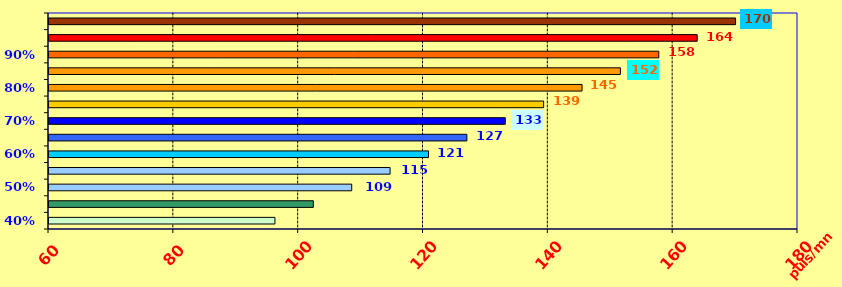
| Category | fréquences cardiaques |
|---|---|
| 40.0 | 96.2 |
| 45.0 | 102.35 |
| 50.0 | 108.5 |
| 55.0 | 114.65 |
| 60.0 | 120.8 |
| 65.0 | 126.95 |
| 70.0 | 133.1 |
| 75.0 | 139.25 |
| 80.0 | 145.4 |
| 85.0 | 151.55 |
| 90.0 | 157.7 |
| 95.0 | 163.85 |
| nan | 170 |